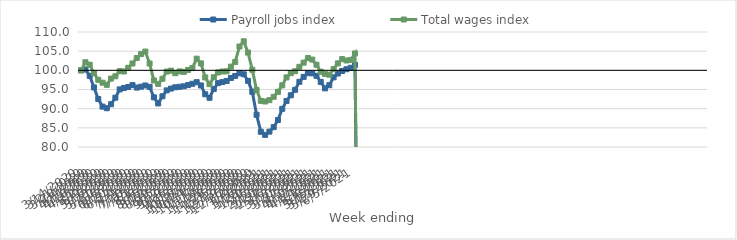
| Category | Payroll jobs index | Total wages index |
|---|---|---|
| 14/03/2020 | 100 | 100 |
| 21/03/2020 | 100.213 | 102.116 |
| 28/03/2020 | 98.56 | 101.476 |
| 04/04/2020 | 95.548 | 99.25 |
| 11/04/2020 | 92.512 | 97.513 |
| 18/04/2020 | 90.536 | 96.779 |
| 25/04/2020 | 90.118 | 96.216 |
| 02/05/2020 | 91.156 | 97.848 |
| 09/05/2020 | 92.856 | 98.442 |
| 16/05/2020 | 95.025 | 99.799 |
| 23/05/2020 | 95.399 | 99.702 |
| 30/05/2020 | 95.656 | 100.664 |
| 06/06/2020 | 96.156 | 101.783 |
| 13/06/2020 | 95.505 | 103.216 |
| 20/06/2020 | 95.729 | 104.234 |
| 27/06/2020 | 96.053 | 104.898 |
| 04/07/2020 | 95.692 | 101.783 |
| 11/07/2020 | 92.956 | 97.351 |
| 18/07/2020 | 91.368 | 96.459 |
| 25/07/2020 | 93.229 | 97.806 |
| 01/08/2020 | 94.773 | 99.683 |
| 08/08/2020 | 95.239 | 99.912 |
| 15/08/2020 | 95.579 | 99.249 |
| 22/08/2020 | 95.705 | 99.724 |
| 29/08/2020 | 95.834 | 99.607 |
| 05/09/2020 | 96.16 | 100.102 |
| 12/09/2020 | 96.495 | 100.622 |
| 19/09/2020 | 96.911 | 103.038 |
| 26/09/2020 | 96.06 | 101.815 |
| 03/10/2020 | 93.756 | 98.153 |
| 10/10/2020 | 92.839 | 96.393 |
| 17/10/2020 | 95.135 | 98.19 |
| 24/10/2020 | 96.662 | 99.456 |
| 31/10/2020 | 96.931 | 99.688 |
| 07/11/2020 | 97.224 | 99.732 |
| 14/11/2020 | 98.012 | 100.96 |
| 21/11/2020 | 98.532 | 102.173 |
| 28/11/2020 | 99.233 | 106.218 |
| 05/12/2020 | 98.978 | 107.575 |
| 12/12/2020 | 97.258 | 104.635 |
| 19/12/2020 | 94.397 | 100.139 |
| 26/12/2020 | 88.405 | 94.866 |
| 02/01/2021 | 83.966 | 92.032 |
| 09/01/2021 | 83.159 | 91.877 |
| 16/01/2021 | 84.005 | 92.217 |
| 23/01/2021 | 85.185 | 93.103 |
| 30/01/2021 | 87.05 | 94.396 |
| 06/02/2021 | 89.952 | 96.093 |
| 13/02/2021 | 92.02 | 98.154 |
| 20/02/2021 | 93.49 | 99.261 |
| 27/02/2021 | 94.916 | 99.758 |
| 06/03/2021 | 97.002 | 100.911 |
| 13/03/2021 | 98.288 | 102.004 |
| 20/03/2021 | 99.263 | 103.205 |
| 27/03/2021 | 99.218 | 102.806 |
| 03/04/2021 | 98.577 | 101.465 |
| 10/04/2021 | 96.97 | 99.634 |
| 17/04/2021 | 95.294 | 99.06 |
| 24/04/2021 | 96.116 | 98.854 |
| 01/05/2021 | 98.175 | 100.324 |
| 08/05/2021 | 99.169 | 101.824 |
| 15/05/2021 | 99.834 | 102.93 |
| 22/05/2021 | 100.284 | 102.568 |
| 29/05/2021 | 100.664 | 102.718 |
| 05/06/2021 | 101.42 | 104.405 |